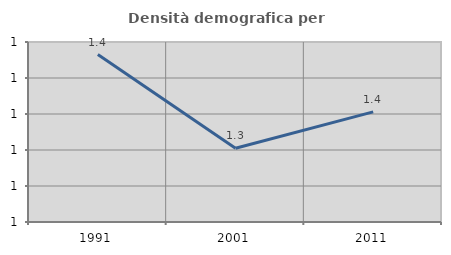
| Category | Densità demografica |
|---|---|
| 1991.0 | 1.433 |
| 2001.0 | 1.302 |
| 2011.0 | 1.353 |